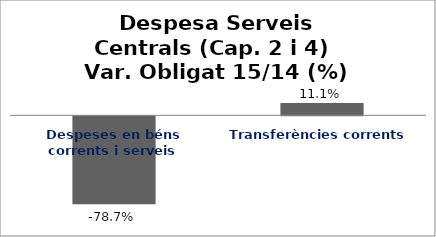
| Category | Series 0 |
|---|---|
| Despeses en béns corrents i serveis | -0.787 |
| Transferències corrents | 0.111 |